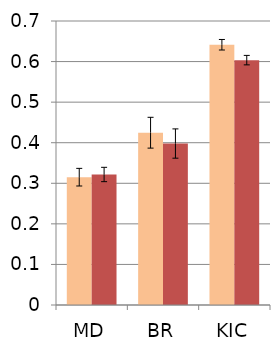
| Category | Series 0 | Series 1 |
|---|---|---|
| MD | 0.315 | 0.322 |
| BR | 0.425 | 0.398 |
| KIC | 0.641 | 0.604 |